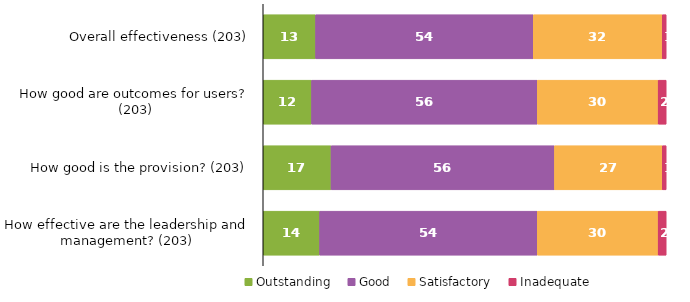
| Category | Outstanding | Good | Satisfactory | Inadequate |
|---|---|---|---|---|
| Overall effectiveness (203) | 13 | 54 | 32 | 1 |
| How good are outcomes for users? (203) | 12 | 56 | 30 | 2 |
| How good is the provision? (203) | 17 | 56 | 27 | 1 |
| How effective are the leadership and management? (203) | 14 | 54 | 30 | 2 |